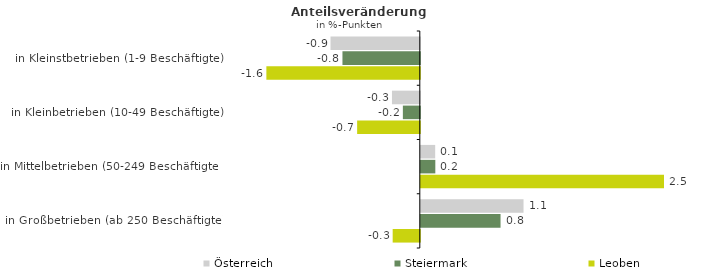
| Category | Österreich | Steiermark | Leoben |
|---|---|---|---|
| in Kleinstbetrieben (1-9 Beschäftigte) | -0.926 | -0.802 | -1.591 |
| in Kleinbetrieben (10-49 Beschäftigte) | -0.289 | -0.176 | -0.65 |
| in Mittelbetrieben (50-249 Beschäftigte) | 0.149 | 0.151 | 2.523 |
| in Großbetrieben (ab 250 Beschäftigte) | 1.066 | 0.827 | -0.281 |